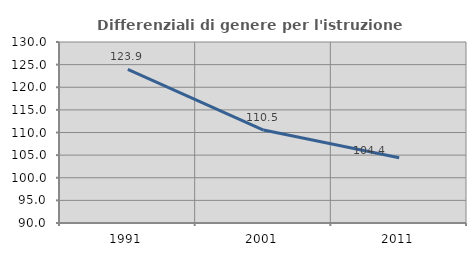
| Category | Differenziali di genere per l'istruzione superiore |
|---|---|
| 1991.0 | 123.942 |
| 2001.0 | 110.539 |
| 2011.0 | 104.407 |